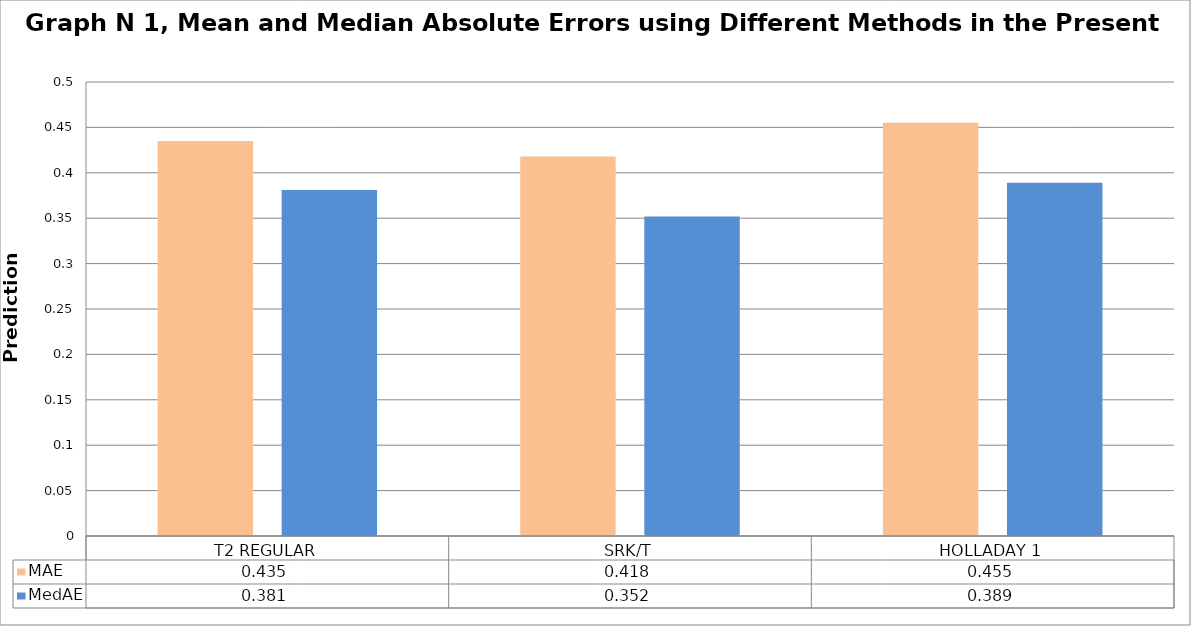
| Category | MAE | MedAE |
|---|---|---|
| T2 REGULAR | 0.435 | 0.381 |
| SRK/T | 0.418 | 0.352 |
| HOLLADAY 1 | 0.455 | 0.389 |